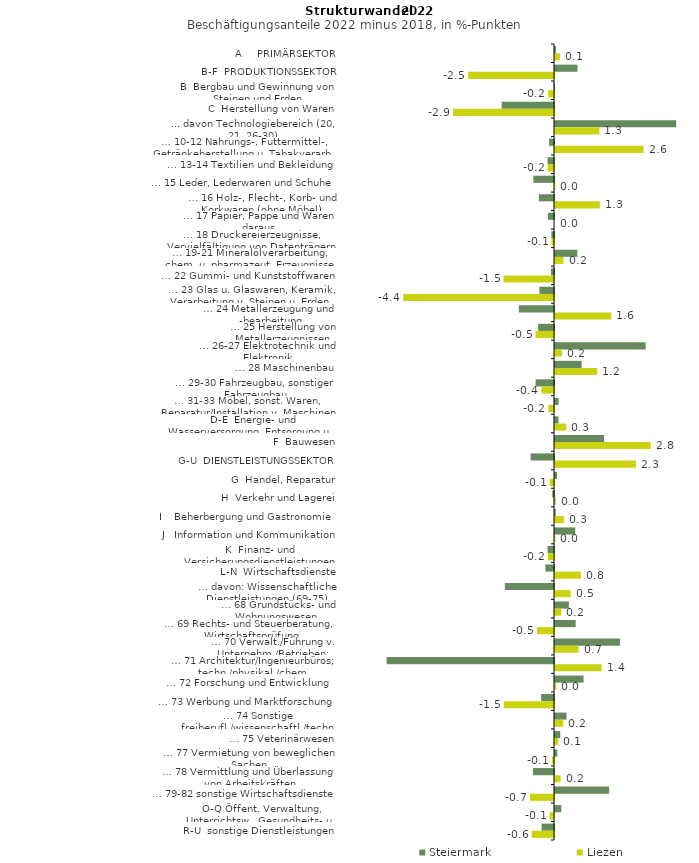
| Category | Steiermark | Liezen |
|---|---|---|
| A     PRIMÄRSEKTOR | 0.025 | 0.142 |
| B-F  PRODUKTIONSSEKTOR | 0.65 | -2.488 |
| B  Bergbau und Gewinnung von Steinen und Erden | -0.011 | -0.171 |
| C  Herstellung von Waren | -1.516 | -2.928 |
| ... davon Technologiebereich (20, 21, 26-30) | 3.513 | 1.288 |
| … 10-12 Nahrungs-, Futtermittel-, Getränkeherstellung u. Tabakverarb. | -0.143 | 2.567 |
| … 13-14 Textilien und Bekleidung | -0.189 | -0.179 |
| … 15 Leder, Lederwaren und Schuhe | -0.6 | 0.009 |
| … 16 Holz-, Flecht-, Korb- und Korkwaren (ohne Möbel)  | -0.44 | 1.299 |
| … 17 Papier, Pappe und Waren daraus  | -0.178 | 0 |
| … 18 Druckereierzeugnisse, Vervielfältigung von Datenträgern | -0.077 | -0.07 |
| … 19-21 Mineralölverarbeitung, chem. u. pharmazeut. Erzeugnisse | 0.646 | 0.247 |
| … 22 Gummi- und Kunststoffwaren | -0.089 | -1.463 |
| … 23 Glas u. Glaswaren, Keramik, Verarbeitung v. Steinen u. Erden  | -0.424 | -4.37 |
| … 24 Metallerzeugung und -bearbeitung | -1.019 | 1.632 |
| … 25 Herstellung von Metallerzeugnissen  | -0.459 | -0.536 |
| … 26-27 Elektrotechnik und Elektronik | 2.628 | 0.203 |
| … 28 Maschinenbau | 0.773 | 1.218 |
| … 29-30 Fahrzeugbau, sonstiger Fahrzeugbau | -0.534 | -0.366 |
| … 31-33 Möbel, sonst. Waren, Reparatur/Installation v. Maschinen | 0.106 | -0.161 |
| D-E  Energie- und Wasserversorgung, Entsorgung u. Rückgewinnung | 0.102 | 0.326 |
| F  Bauwesen | 1.424 | 2.773 |
| G-U  DIENSTLEISTUNGSSEKTOR | -0.676 | 2.346 |
| G  Handel, Reparatur | 0.059 | -0.123 |
| H  Verkehr und Lagerei | -0.05 | 0.024 |
| I    Beherbergung und Gastronomie | 0.02 | 0.264 |
| J   Information und Kommunikation | 0.588 | 0.013 |
| K  Finanz- und Versicherungsdienstleistungen | -0.188 | -0.173 |
| L-N  Wirtschaftsdienste | -0.252 | 0.751 |
| … davon: Wissenschaftliche Dienstleistungen (69-75) | -1.425 | 0.453 |
| … 68 Grundstücks- und Wohnungswesen  | 0.402 | 0.18 |
| … 69 Rechts- und Steuerberatung, Wirtschaftsprüfung | 0.6 | -0.496 |
| … 70 Verwalt./Führung v. Unternehm./Betrieben; Unternehmensberat. | 1.883 | 0.684 |
| … 71 Architektur/Ingenieurbüros; techn./physikal./chem. Untersuchung | -4.85 | 1.351 |
| … 72 Forschung und Entwicklung  | 0.828 | 0.036 |
| … 73 Werbung und Marktforschung | -0.372 | -1.454 |
| … 74 Sonstige freiberufl./wissenschaftl./techn. Tätigkeiten | 0.334 | 0.235 |
| … 75 Veterinärwesen | 0.152 | 0.097 |
| … 77 Vermietung von beweglichen Sachen  | 0.067 | -0.056 |
| … 78 Vermittlung und Überlassung von Arbeitskräften | -0.611 | 0.162 |
| … 79-82 sonstige Wirtschaftsdienste | 1.569 | -0.697 |
| O-Q Öffent. Verwaltung, Unterrichtsw., Gesundheits- u. Sozialwesen | 0.182 | -0.126 |
| R-U  sonstige Dienstleistungen | -0.359 | -0.646 |